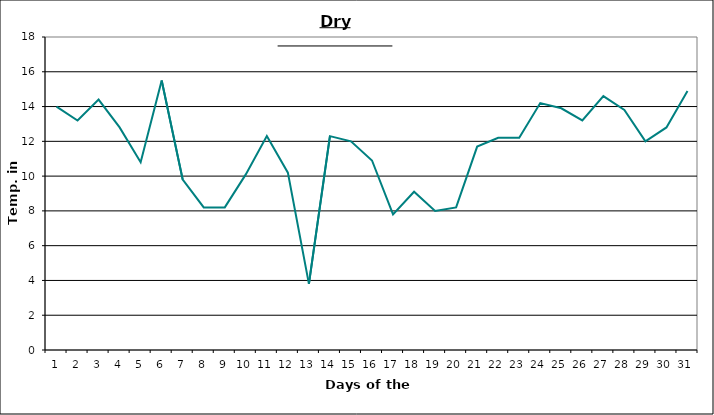
| Category | Series 0 |
|---|---|
| 0 | 14 |
| 1 | 13.2 |
| 2 | 14.4 |
| 3 | 12.8 |
| 4 | 10.8 |
| 5 | 15.5 |
| 6 | 9.8 |
| 7 | 8.2 |
| 8 | 8.2 |
| 9 | 10.1 |
| 10 | 12.3 |
| 11 | 10.2 |
| 12 | 3.8 |
| 13 | 12.3 |
| 14 | 12 |
| 15 | 10.9 |
| 16 | 7.8 |
| 17 | 9.1 |
| 18 | 8 |
| 19 | 8.2 |
| 20 | 11.7 |
| 21 | 12.2 |
| 22 | 12.2 |
| 23 | 14.2 |
| 24 | 13.9 |
| 25 | 13.2 |
| 26 | 14.6 |
| 27 | 13.8 |
| 28 | 12 |
| 29 | 12.8 |
| 30 | 14.9 |